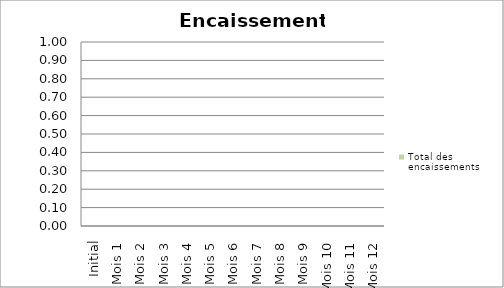
| Category | Total des encaissements |
|---|---|
| Initial | 0 |
| Mois 1 | 0 |
| Mois 2 | 0 |
| Mois 3 | 0 |
| Mois 4 | 0 |
| Mois 5 | 0 |
| Mois 6 | 0 |
| Mois 7 | 0 |
| Mois 8 | 0 |
| Mois 9 | 0 |
| Mois 10 | 0 |
| Mois 11 | 0 |
| Mois 12 | 0 |